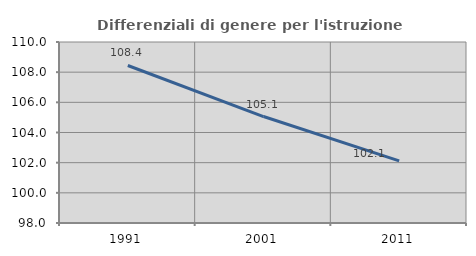
| Category | Differenziali di genere per l'istruzione superiore |
|---|---|
| 1991.0 | 108.443 |
| 2001.0 | 105.059 |
| 2011.0 | 102.118 |